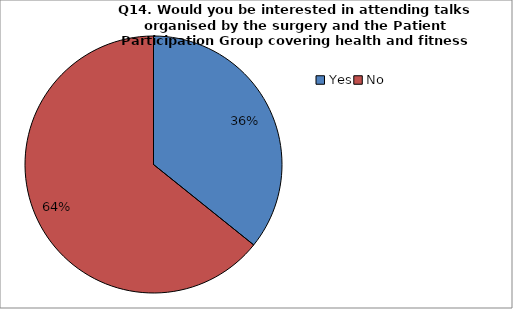
| Category | Series 0 |
|---|---|
| Yes | 152 |
| No | 273 |